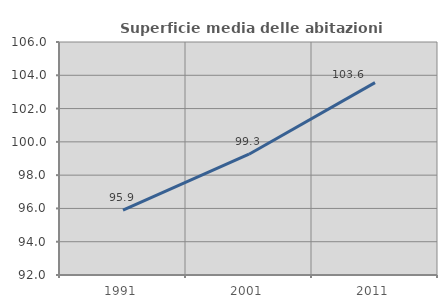
| Category | Superficie media delle abitazioni occupate |
|---|---|
| 1991.0 | 95.898 |
| 2001.0 | 99.258 |
| 2011.0 | 103.556 |